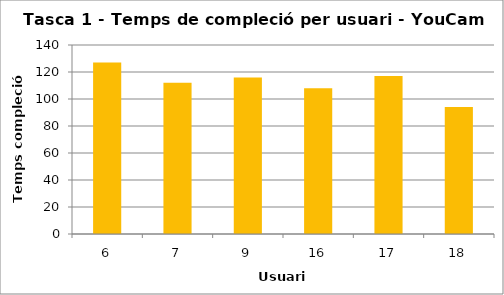
| Category | Temps de compleció (s) |
|---|---|
| 6.0 | 127 |
| 7.0 | 112 |
| 9.0 | 116 |
| 16.0 | 108 |
| 17.0 | 117 |
| 18.0 | 94 |